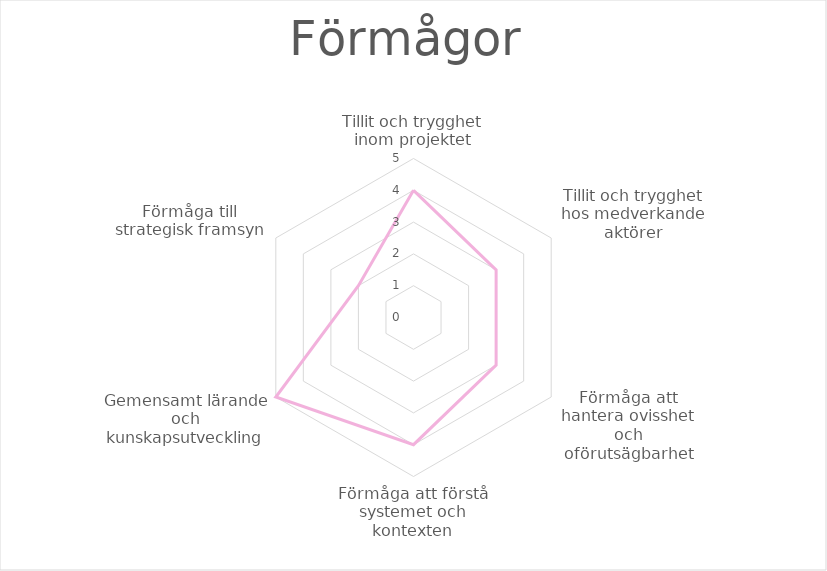
| Category | Förmågor |
|---|---|
| Tillit och trygghet inom projektet | 4 |
| Tillit och trygghet hos medverkande aktörer | 3 |
| Förmåga att hantera ovisshet och oförutsägbarhet | 3 |
| Förmåga att förstå systemet och kontexten | 4 |
| Gemensamt lärande och kunskapsutveckling | 5 |
| Förmåga till strategisk framsyn | 2 |